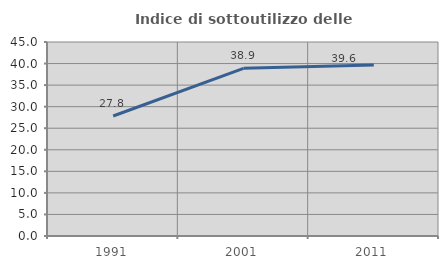
| Category | Indice di sottoutilizzo delle abitazioni  |
|---|---|
| 1991.0 | 27.83 |
| 2001.0 | 38.889 |
| 2011.0 | 39.64 |